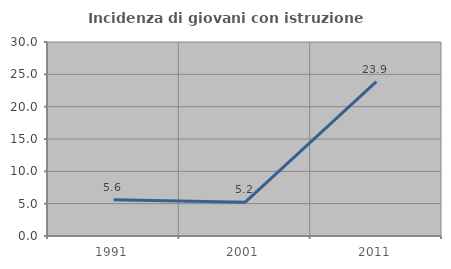
| Category | Incidenza di giovani con istruzione universitaria |
|---|---|
| 1991.0 | 5.612 |
| 2001.0 | 5.213 |
| 2011.0 | 23.858 |